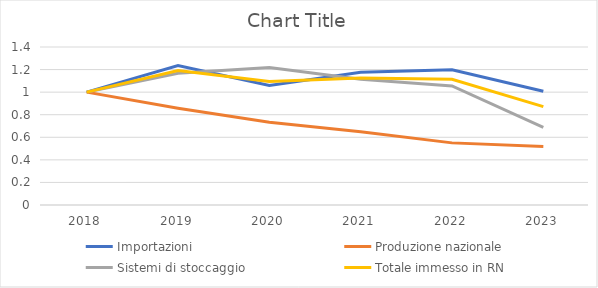
| Category | Importazioni | Produzione nazionale | Sistemi di stoccaggio | Totale immesso in RN |
|---|---|---|---|---|
| 2018.0 | 1 | 1 | 1 | 1 |
| 2019.0 | 1.236 | 0.858 | 1.168 | 1.192 |
| 2020.0 | 1.058 | 0.733 | 1.218 | 1.095 |
| 2021.0 | 1.175 | 0.649 | 1.114 | 1.126 |
| 2022.0 | 1.198 | 0.55 | 1.055 | 1.113 |
| 2023.0 | 1.008 | 0.518 | 0.689 | 0.872 |